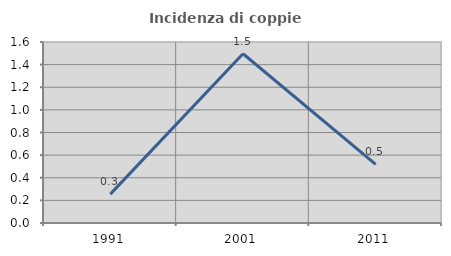
| Category | Incidenza di coppie miste |
|---|---|
| 1991.0 | 0.255 |
| 2001.0 | 1.496 |
| 2011.0 | 0.518 |